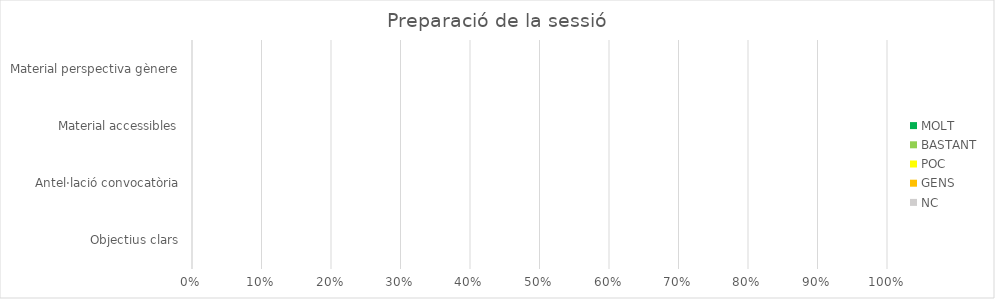
| Category | MOLT | BASTANT | POC | GENS | NC |
|---|---|---|---|---|---|
| Objectius clars | 0 | 0 | 0 | 0 | 0 |
| Antel·lació convocatòria | 0 | 0 | 0 | 0 | 0 |
| Material accessibles | 0 | 0 | 0 | 0 | 0 |
| Material perspectiva gènere | 0 | 0 | 0 | 0 | 0 |